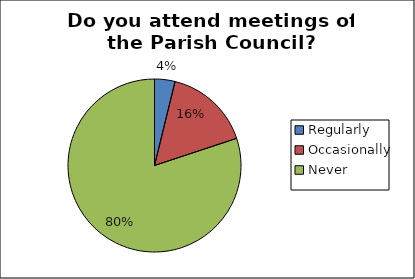
| Category | Series 0 |
|---|---|
| Regularly | 0.038 |
| Occasionally | 0.161 |
| Never | 0.801 |